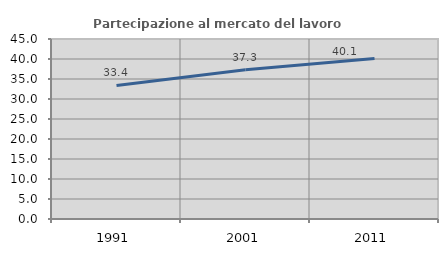
| Category | Partecipazione al mercato del lavoro  femminile |
|---|---|
| 1991.0 | 33.386 |
| 2001.0 | 37.299 |
| 2011.0 | 40.096 |